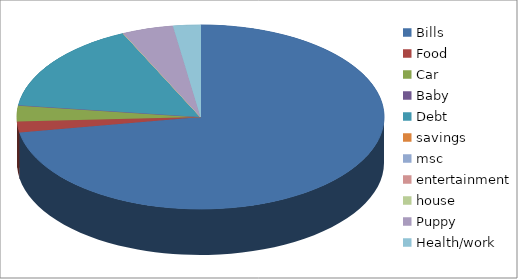
| Category | Series 0 |
|---|---|
| Bills | 900 |
| Food | 23.99 |
| Car | 35 |
| Baby  | 0 |
| Debt | 200 |
| savings | 0 |
| msc | 0 |
| entertainment | 0 |
| house | 0 |
| Puppy | 56 |
| Health/work | 30 |